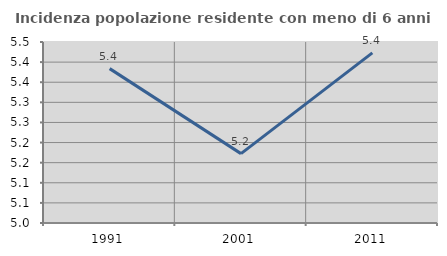
| Category | Incidenza popolazione residente con meno di 6 anni |
|---|---|
| 1991.0 | 5.384 |
| 2001.0 | 5.172 |
| 2011.0 | 5.423 |